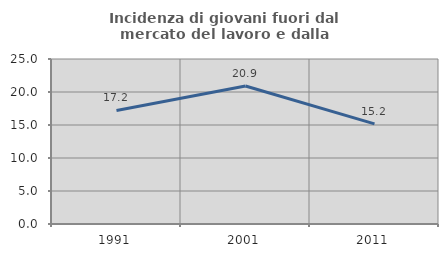
| Category | Incidenza di giovani fuori dal mercato del lavoro e dalla formazione  |
|---|---|
| 1991.0 | 17.208 |
| 2001.0 | 20.901 |
| 2011.0 | 15.166 |